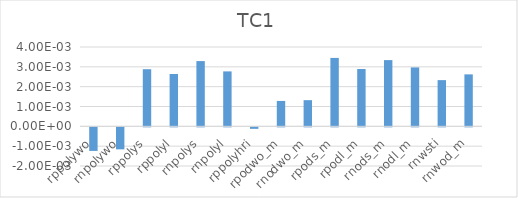
| Category | TC1 |
|---|---|
| rppolywo | -0.001 |
| rnpolywo | -0.001 |
| rppolys | 0.003 |
| rppolyl | 0.003 |
| rnpolys | 0.003 |
| rnpolyl | 0.003 |
| rppolyhri | 0 |
| rpodwo_m | 0.001 |
| rnodwo_m | 0.001 |
| rpods_m | 0.003 |
| rpodl_m | 0.003 |
| rnods_m | 0.003 |
| rnodl_m | 0.003 |
| rnwsti | 0.002 |
| rnwod_m | 0.003 |